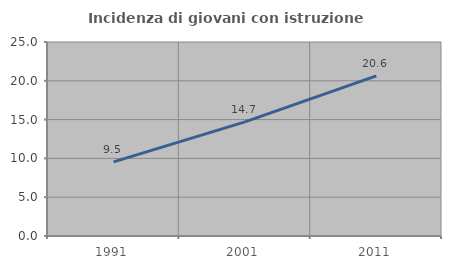
| Category | Incidenza di giovani con istruzione universitaria |
|---|---|
| 1991.0 | 9.546 |
| 2001.0 | 14.702 |
| 2011.0 | 20.633 |